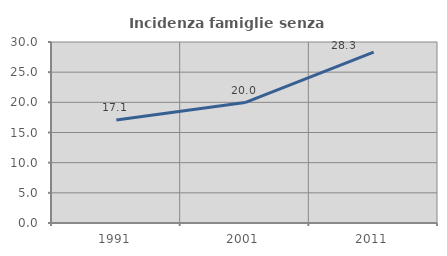
| Category | Incidenza famiglie senza nuclei |
|---|---|
| 1991.0 | 17.059 |
| 2001.0 | 19.955 |
| 2011.0 | 28.311 |